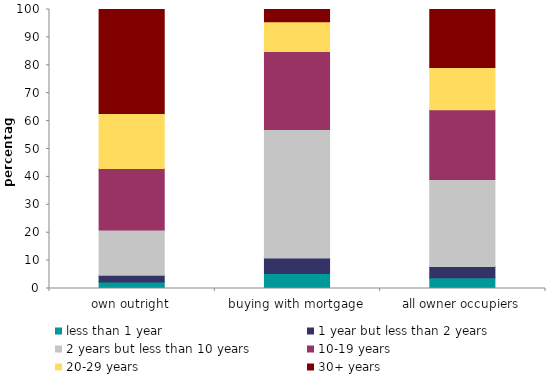
| Category | less than 1 year | 1 year but less than 2 years | 2 years but less than 10 years | 10-19 years | 20-29 years | 30+ years |
|---|---|---|---|---|---|---|
| own outright | 2.321 | 2.436 | 16.217 | 22.054 | 19.687 | 37.285 |
| buying with mortgage | 5.378 | 5.59 | 46.045 | 27.967 | 10.592 | 4.429 |
| all owner occupiers | 3.853 | 4.016 | 31.165 | 25.017 | 15.129 | 20.82 |